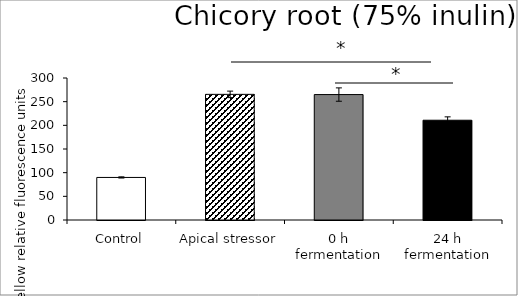
| Category | average |
|---|---|
| Control | 89.919 |
| Apical stressor | 265.444 |
| 0 h fermentation | 265.005 |
| 24 h fermentation | 210.791 |